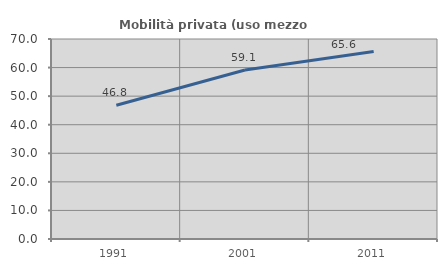
| Category | Mobilità privata (uso mezzo privato) |
|---|---|
| 1991.0 | 46.805 |
| 2001.0 | 59.126 |
| 2011.0 | 65.625 |